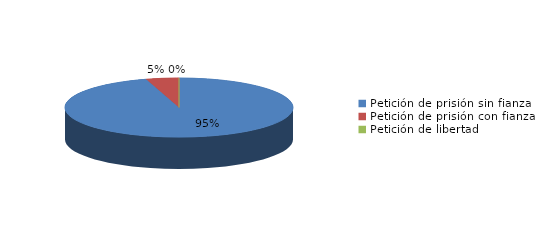
| Category | Series 0 |
|---|---|
| Petición de prisión sin fianza | 123 |
| Petición de prisión con fianza | 6 |
| Petición de libertad | 0 |